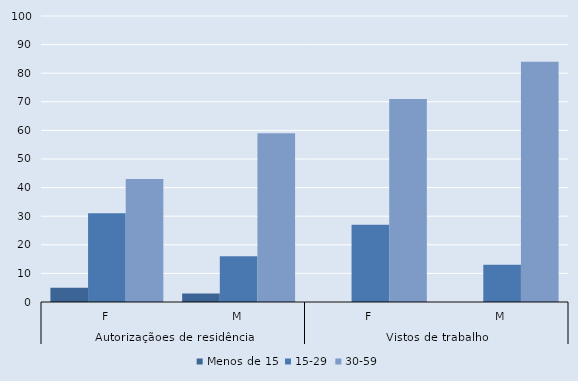
| Category | Menos de 15 | 15-29 | 30-59 |
|---|---|---|---|
| 0 | 5 | 31 | 43 |
| 1 | 3 | 16 | 59 |
| 2 | 0 | 27 | 71 |
| 3 | 0 | 13 | 84 |